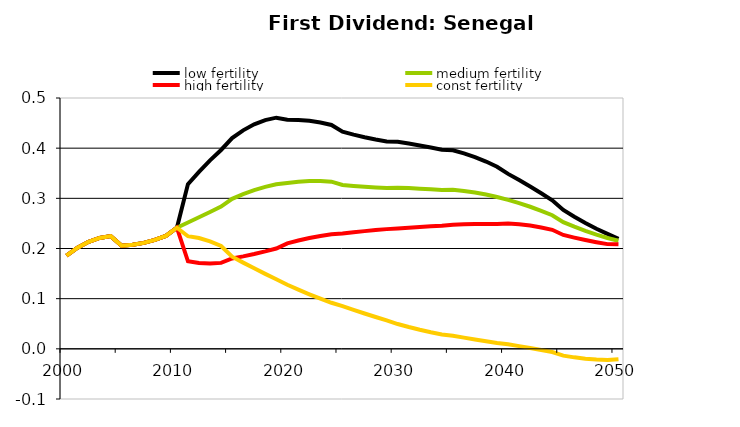
| Category | low fertility | medium fertility | high fertility | const fertility |
|---|---|---|---|---|
| 2000.0 | 0.186 | 0.186 | 0.186 | 0.186 |
| 2001.0 | 0.202 | 0.202 | 0.202 | 0.202 |
| 2002.0 | 0.213 | 0.213 | 0.213 | 0.213 |
| 2003.0 | 0.221 | 0.221 | 0.221 | 0.221 |
| 2004.0 | 0.225 | 0.225 | 0.225 | 0.225 |
| 2005.0 | 0.206 | 0.206 | 0.206 | 0.206 |
| 2006.0 | 0.207 | 0.207 | 0.207 | 0.207 |
| 2007.0 | 0.211 | 0.211 | 0.211 | 0.211 |
| 2008.0 | 0.217 | 0.217 | 0.217 | 0.217 |
| 2009.0 | 0.225 | 0.225 | 0.225 | 0.225 |
| 2010.0 | 0.241 | 0.241 | 0.241 | 0.241 |
| 2011.0 | 0.328 | 0.252 | 0.175 | 0.224 |
| 2012.0 | 0.353 | 0.262 | 0.171 | 0.221 |
| 2013.0 | 0.376 | 0.273 | 0.17 | 0.214 |
| 2014.0 | 0.396 | 0.283 | 0.171 | 0.205 |
| 2015.0 | 0.42 | 0.299 | 0.18 | 0.184 |
| 2016.0 | 0.436 | 0.308 | 0.184 | 0.172 |
| 2017.0 | 0.447 | 0.316 | 0.189 | 0.16 |
| 2018.0 | 0.456 | 0.323 | 0.194 | 0.149 |
| 2019.0 | 0.461 | 0.328 | 0.2 | 0.139 |
| 2020.0 | 0.456 | 0.331 | 0.21 | 0.128 |
| 2021.0 | 0.456 | 0.333 | 0.216 | 0.118 |
| 2022.0 | 0.455 | 0.334 | 0.221 | 0.109 |
| 2023.0 | 0.451 | 0.334 | 0.225 | 0.1 |
| 2024.0 | 0.446 | 0.333 | 0.228 | 0.092 |
| 2025.0 | 0.433 | 0.327 | 0.23 | 0.085 |
| 2026.0 | 0.427 | 0.325 | 0.232 | 0.078 |
| 2027.0 | 0.422 | 0.323 | 0.235 | 0.07 |
| 2028.0 | 0.417 | 0.322 | 0.237 | 0.063 |
| 2029.0 | 0.413 | 0.321 | 0.239 | 0.057 |
| 2030.0 | 0.413 | 0.321 | 0.24 | 0.049 |
| 2031.0 | 0.409 | 0.32 | 0.241 | 0.043 |
| 2032.0 | 0.405 | 0.319 | 0.243 | 0.038 |
| 2033.0 | 0.401 | 0.318 | 0.244 | 0.033 |
| 2034.0 | 0.397 | 0.317 | 0.246 | 0.029 |
| 2035.0 | 0.396 | 0.317 | 0.248 | 0.026 |
| 2036.0 | 0.39 | 0.315 | 0.248 | 0.022 |
| 2037.0 | 0.382 | 0.312 | 0.249 | 0.019 |
| 2038.0 | 0.373 | 0.308 | 0.249 | 0.015 |
| 2039.0 | 0.363 | 0.303 | 0.249 | 0.012 |
| 2040.0 | 0.349 | 0.297 | 0.25 | 0.009 |
| 2041.0 | 0.336 | 0.29 | 0.248 | 0.005 |
| 2042.0 | 0.324 | 0.283 | 0.246 | 0.002 |
| 2043.0 | 0.31 | 0.275 | 0.242 | -0.002 |
| 2044.0 | 0.296 | 0.266 | 0.237 | -0.006 |
| 2045.0 | 0.277 | 0.252 | 0.227 | -0.014 |
| 2046.0 | 0.263 | 0.244 | 0.222 | -0.017 |
| 2047.0 | 0.251 | 0.235 | 0.217 | -0.02 |
| 2048.0 | 0.239 | 0.228 | 0.213 | -0.021 |
| 2049.0 | 0.229 | 0.221 | 0.209 | -0.022 |
| 2050.0 | 0.219 | 0.216 | 0.208 | -0.021 |